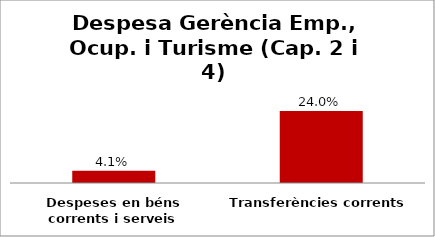
| Category | Series 0 |
|---|---|
| Despeses en béns corrents i serveis | 0.041 |
| Transferències corrents | 0.24 |